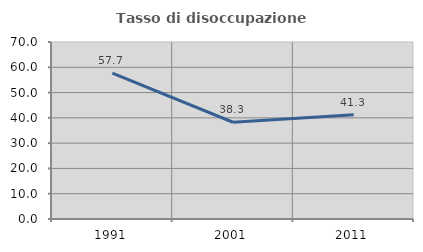
| Category | Tasso di disoccupazione giovanile  |
|---|---|
| 1991.0 | 57.669 |
| 2001.0 | 38.261 |
| 2011.0 | 41.25 |